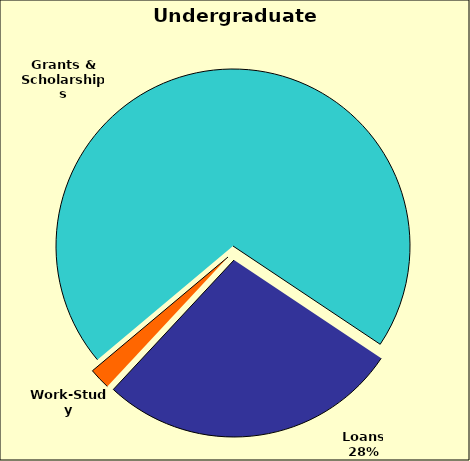
| Category | Series 0 |
|---|---|
| Grants & Scholarships | 0.705 |
| Loans | 0.276 |
| Work-Study | 0.019 |